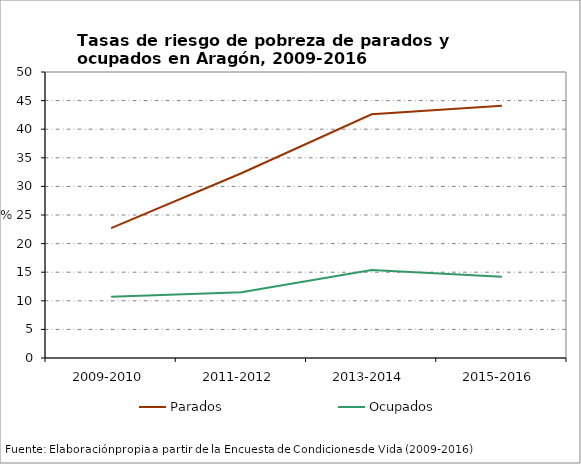
| Category | Parados | Ocupados |
|---|---|---|
| 2009-2010 | 22.7 | 10.7 |
| 2011-2012 | 32.3 | 11.5 |
| 2013-2014 | 42.6 | 15.4 |
| 2015-2016 | 44.1 | 14.2 |